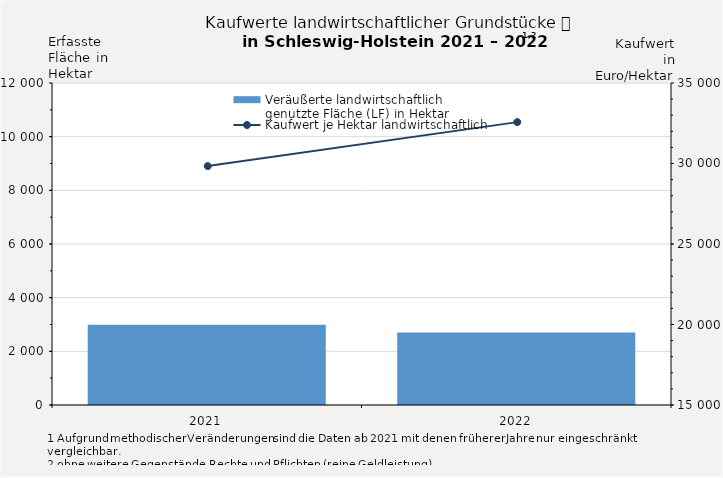
| Category | Veräußerte landwirtschaftlich 
genutzte Fläche (LF) in Hektar |
|---|---|
| 2021.0 | 2989 |
| 2022.0 | 2699 |